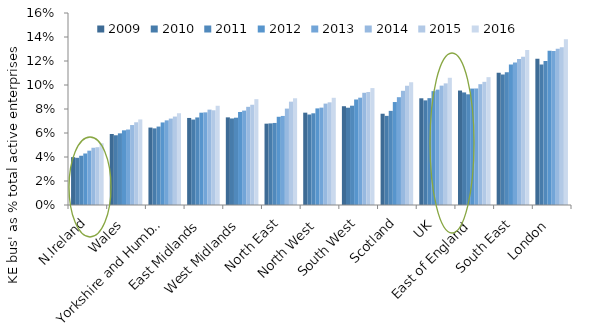
| Category | 2009 | 2010 | 2011 | 2012 | 2013 | 2014 | 2015 | 2016 |
|---|---|---|---|---|---|---|---|---|
| N.Ireland | 0.04 | 0.039 | 0.041 | 0.043 | 0.045 | 0.048 | 0.048 | 0.051 |
| Wales | 0.059 | 0.058 | 0.06 | 0.062 | 0.063 | 0.067 | 0.069 | 0.071 |
| Yorkshire and Humber | 0.065 | 0.064 | 0.065 | 0.069 | 0.071 | 0.072 | 0.074 | 0.076 |
| East Midlands | 0.073 | 0.071 | 0.073 | 0.077 | 0.077 | 0.079 | 0.079 | 0.083 |
| West Midlands | 0.073 | 0.072 | 0.073 | 0.078 | 0.079 | 0.082 | 0.084 | 0.088 |
| North East | 0.068 | 0.068 | 0.068 | 0.074 | 0.074 | 0.08 | 0.086 | 0.089 |
| North West | 0.077 | 0.075 | 0.076 | 0.081 | 0.081 | 0.085 | 0.086 | 0.089 |
| South West | 0.082 | 0.081 | 0.083 | 0.088 | 0.089 | 0.094 | 0.094 | 0.097 |
| Scotland | 0.076 | 0.074 | 0.078 | 0.086 | 0.09 | 0.095 | 0.099 | 0.102 |
| UK | 0.089 | 0.087 | 0.089 | 0.095 | 0.096 | 0.099 | 0.101 | 0.106 |
| East of England | 0.095 | 0.094 | 0.092 | 0.097 | 0.097 | 0.101 | 0.103 | 0.107 |
| South East | 0.11 | 0.109 | 0.111 | 0.117 | 0.119 | 0.122 | 0.124 | 0.129 |
| London | 0.122 | 0.117 | 0.12 | 0.129 | 0.128 | 0.13 | 0.131 | 0.138 |